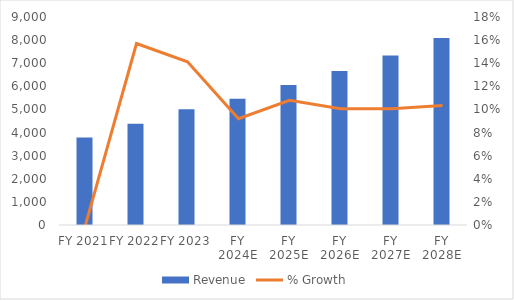
| Category | Revenue |
|---|---|
| FY 2021 | 3790.4 |
| FY 2022 | 4385.7 |
| FY 2023 | 5005 |
| FY 2024E | 5465.188 |
| FY 2025E | 6054.879 |
| FY 2026E | 6664.642 |
| FY 2027E | 7335.755 |
| FY 2028E | 8094.524 |